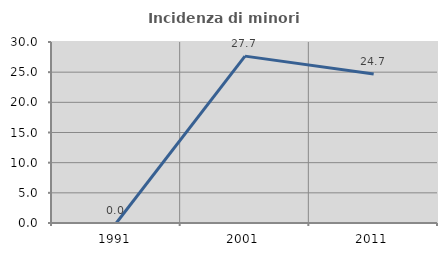
| Category | Incidenza di minori stranieri |
|---|---|
| 1991.0 | 0 |
| 2001.0 | 27.66 |
| 2011.0 | 24.691 |